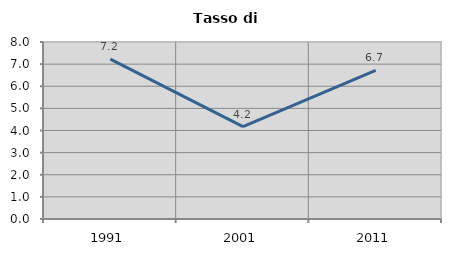
| Category | Tasso di disoccupazione   |
|---|---|
| 1991.0 | 7.226 |
| 2001.0 | 4.176 |
| 2011.0 | 6.721 |